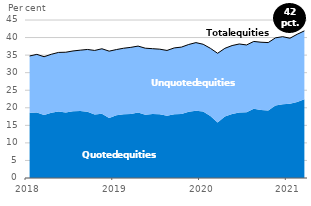
| Category | Total equitites |
|---|---|
| 2018.0 | 34.75 |
| nan | 35.21 |
| nan | 34.54 |
| nan | 35.24 |
| nan | 35.77 |
| nan | 35.82 |
| nan | 36.18 |
| nan | 36.41 |
| nan | 36.61 |
| nan | 36.33 |
| nan | 36.81 |
| nan | 36.13 |
| 2019.0 | 36.58 |
| nan | 36.96 |
| nan | 37.21 |
| nan | 37.57 |
| nan | 36.97 |
| nan | 36.83 |
| nan | 36.69 |
| nan | 36.33 |
| nan | 37.05 |
| nan | 37.28 |
| nan | 38.03 |
| nan | 38.56 |
| 2020.0 | 38.09 |
| nan | 36.94 |
| nan | 35.52 |
| nan | 36.93 |
| nan | 37.72 |
| nan | 38.17 |
| nan | 37.89 |
| nan | 38.89 |
| nan | 38.67 |
| nan | 38.57 |
| nan | 39.92 |
| nan | 40.25 |
| 2021.0 | 39.81 |
| nan | 40.93 |
| nan | 41.91 |